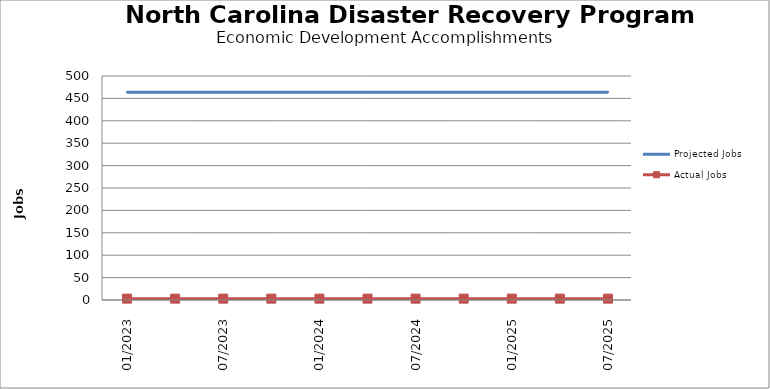
| Category | Projected Jobs | Actual Jobs |
|---|---|---|
| 01/2023 | 464 | 3 |
| 4/2023 | 464 | 3 |
| 07/2023 | 464 | 3 |
| 10/2023 | 464 | 3 |
| 01/2024 | 464 | 3 |
| 4/2024 | 464 | 3 |
| 07/2024 | 464 | 3 |
| 10/2024 | 464 | 3 |
| 01/2025 | 464 | 3 |
| 4/2025 | 464 | 3 |
| 07/2025 | 464 | 3 |